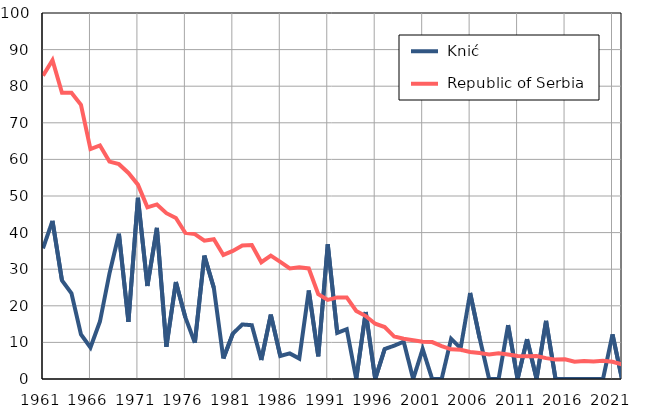
| Category |  Knić |  Republic of Serbia |
|---|---|---|
| 1961.0 | 35.7 | 82.9 |
| 1962.0 | 43.2 | 87.1 |
| 1963.0 | 26.9 | 78.2 |
| 1964.0 | 23.4 | 78.2 |
| 1965.0 | 12.2 | 74.9 |
| 1966.0 | 8.6 | 62.8 |
| 1967.0 | 15.7 | 63.8 |
| 1968.0 | 28.8 | 59.4 |
| 1969.0 | 39.7 | 58.7 |
| 1970.0 | 15.6 | 56.3 |
| 1971.0 | 49.5 | 53.1 |
| 1972.0 | 25.4 | 46.9 |
| 1973.0 | 41.3 | 47.7 |
| 1974.0 | 8.8 | 45.3 |
| 1975.0 | 26.5 | 44 |
| 1976.0 | 16.8 | 39.9 |
| 1977.0 | 9.9 | 39.6 |
| 1978.0 | 33.7 | 37.8 |
| 1979.0 | 24.9 | 38.2 |
| 1980.0 | 5.6 | 33.9 |
| 1981.0 | 12.4 | 35 |
| 1982.0 | 14.9 | 36.5 |
| 1983.0 | 14.7 | 36.6 |
| 1984.0 | 5.2 | 31.9 |
| 1985.0 | 17.6 | 33.7 |
| 1986.0 | 6.3 | 32 |
| 1987.0 | 7 | 30.2 |
| 1988.0 | 5.6 | 30.5 |
| 1989.0 | 24.2 | 30.2 |
| 1990.0 | 6.2 | 23.2 |
| 1991.0 | 36.8 | 21.6 |
| 1992.0 | 12.6 | 22.3 |
| 1993.0 | 13.6 | 22.3 |
| 1994.0 | 0 | 18.6 |
| 1995.0 | 18.3 | 17.2 |
| 1996.0 | 0 | 15.1 |
| 1997.0 | 8.2 | 14.2 |
| 1998.0 | 9.1 | 11.6 |
| 1999.0 | 10.2 | 11 |
| 2000.0 | 0 | 10.6 |
| 2001.0 | 8.2 | 10.2 |
| 2002.0 | 0 | 10.1 |
| 2003.0 | 0 | 9 |
| 2004.0 | 11 | 8.1 |
| 2005.0 | 8.4 | 8 |
| 2006.0 | 23.5 | 7.4 |
| 2007.0 | 11.2 | 7.1 |
| 2008.0 | 0 | 6.7 |
| 2009.0 | 0 | 7 |
| 2010.0 | 14.7 | 6.7 |
| 2011.0 | 0 | 6.3 |
| 2012.0 | 10.9 | 6.2 |
| 2013.0 | 0 | 6.3 |
| 2014.0 | 15.9 | 5.7 |
| 2015.0 | 0 | 5.3 |
| 2016.0 | 0 | 5.4 |
| 2017.0 | 0 | 4.7 |
| 2018.0 | 0 | 4.9 |
| 2019.0 | 0 | 4.8 |
| 2020.0 | 0 | 5 |
| 2021.0 | 12.2 | 4.7 |
| 2022.0 | 0 | 4 |